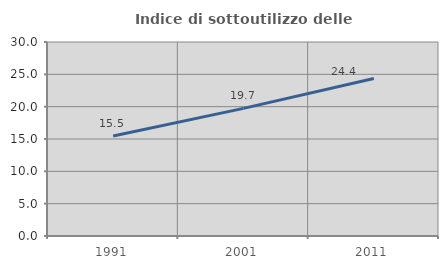
| Category | Indice di sottoutilizzo delle abitazioni  |
|---|---|
| 1991.0 | 15.462 |
| 2001.0 | 19.734 |
| 2011.0 | 24.351 |